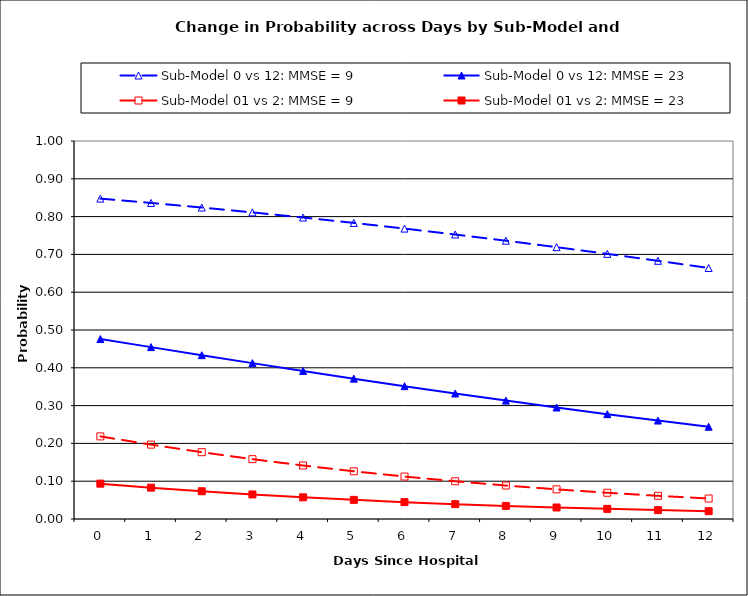
| Category | Sub-Model 0 vs 12: MMSE = 9 | Sub-Model 0 vs 12: MMSE = 23 | Sub-Model 01 vs 2: MMSE = 9 | Sub-Model 01 vs 2: MMSE = 23 |
|---|---|---|---|---|
| 0.0 | 0.848 | 0.476 | 0.218 | 0.094 |
| 1.0 | 0.836 | 0.455 | 0.197 | 0.083 |
| 2.0 | 0.824 | 0.433 | 0.177 | 0.073 |
| 3.0 | 0.811 | 0.412 | 0.158 | 0.065 |
| 4.0 | 0.798 | 0.392 | 0.141 | 0.057 |
| 5.0 | 0.783 | 0.371 | 0.126 | 0.051 |
| 6.0 | 0.768 | 0.351 | 0.112 | 0.045 |
| 7.0 | 0.753 | 0.332 | 0.1 | 0.039 |
| 8.0 | 0.736 | 0.313 | 0.089 | 0.035 |
| 9.0 | 0.719 | 0.295 | 0.078 | 0.03 |
| 10.0 | 0.701 | 0.277 | 0.069 | 0.027 |
| 11.0 | 0.683 | 0.26 | 0.061 | 0.024 |
| 12.0 | 0.664 | 0.244 | 0.054 | 0.021 |